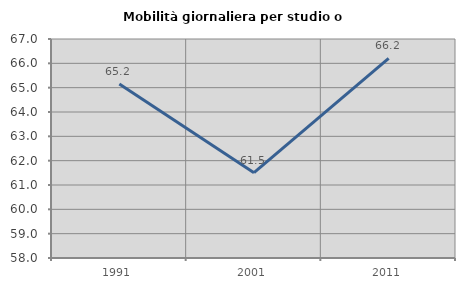
| Category | Mobilità giornaliera per studio o lavoro |
|---|---|
| 1991.0 | 65.15 |
| 2001.0 | 61.508 |
| 2011.0 | 66.205 |